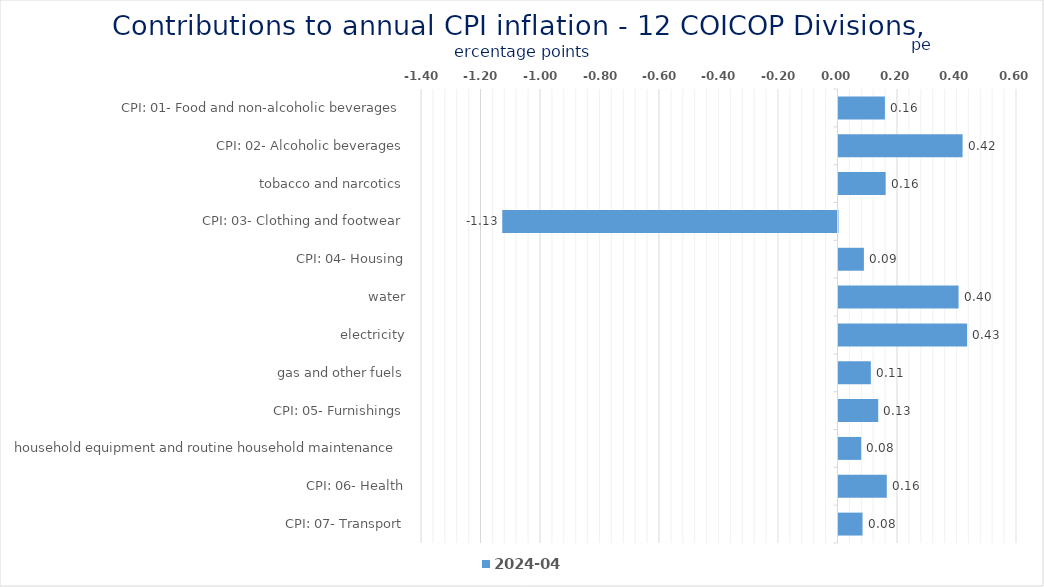
| Category | 2024-04 |
|---|---|
| CPI: 01- Food and non-alcoholic beverages | 0.156 |
| CPI: 02- Alcoholic beverages, tobacco and narcotics | 0.417 |
| CPI: 03- Clothing and footwear | 0.158 |
| CPI: 04- Housing, water, electricity, gas and other fuels | -1.127 |
| CPI: 05- Furnishings, household equipment and routine household maintenance | 0.085 |
| CPI: 06- Health | 0.404 |
| CPI: 07- Transport | 0.432 |
| CPI: 08- Communication | 0.109 |
| CPI: 09- Recreation and culture | 0.134 |
| CPI: 10- Education | 0.076 |
| CPI: 11- Restaurants and hotels | 0.162 |
| CPI: 12- Miscellaneous goods and services | 0.081 |